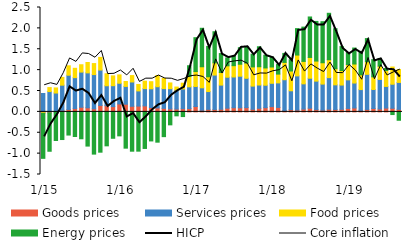
| Category | Goods prices | Services prices | Food prices | Energy prices |
|---|---|---|---|---|
|  1/15 | -0.019 | 0.44 | -0.016 | -1.079 |
| 2 | -0.027 | 0.486 | 0.095 | -0.917 |
| 3 | -0.003 | 0.452 | 0.122 | -0.684 |
| 4 | 0.037 | 0.603 | 0.186 | -0.662 |
| 5 | 0.058 | 0.82 | 0.226 | -0.555 |
| 6 | 0.079 | 0.741 | 0.224 | -0.591 |
| 7 | 0.111 | 0.842 | 0.176 | -0.644 |
| 8 | 0.098 | 0.837 | 0.249 | -0.819 |
| 9 | 0.074 | 0.82 | 0.263 | -1.012 |
| 10 | 0.155 | 0.847 | 0.303 | -0.966 |
| 11 | 0.147 | 0.478 | 0.287 | -0.813 |
| 12 | 0.126 | 0.501 | 0.234 | -0.632 |
|  1/16 | 0.19 | 0.495 | 0.2 | -0.574 |
| 2 | 0.183 | 0.426 | 0.117 | -0.869 |
| 3 | 0.134 | 0.582 | 0.153 | -0.942 |
| 4 | 0.139 | 0.363 | 0.155 | -0.941 |
| 5 | 0.144 | 0.414 | 0.178 | -0.876 |
| 6 | 0.104 | 0.449 | 0.17 | -0.696 |
| 7 | 0.095 | 0.508 | 0.269 | -0.726 |
| 8 | 0.084 | 0.473 | 0.245 | -0.593 |
| 9 | 0.071 | 0.485 | 0.137 | -0.311 |
| 10 | 0.068 | 0.45 | 0.076 | -0.095 |
| 11 | 0.076 | 0.474 | 0.138 | -0.112 |
| 12 | 0.079 | 0.521 | 0.246 | 0.26 |
|  1/17 | 0.128 | 0.48 | 0.357 | 0.811 |
| 2 | 0.04 | 0.537 | 0.504 | 0.922 |
| 3 | 0.06 | 0.426 | 0.354 | 0.727 |
| 4 | 0.058 | 0.824 | 0.292 | 0.745 |
| 5 | 0.063 | 0.579 | 0.301 | 0.454 |
| 6 | 0.089 | 0.742 | 0.273 | 0.189 |
| 7 | 0.1 | 0.737 | 0.271 | 0.222 |
| 8 | 0.097 | 0.758 | 0.286 | 0.396 |
| 9 | 0.102 | 0.703 | 0.365 | 0.396 |
| 10 | 0.062 | 0.555 | 0.46 | 0.304 |
| 11 | 0.086 | 0.557 | 0.438 | 0.479 |
| 12 | 0.101 | 0.537 | 0.414 | 0.304 |
|  1/18 | 0.126 | 0.559 | 0.39 | 0.238 |
| 2 | 0.107 | 0.587 | 0.211 | 0.229 |
| 3 | 0.034 | 0.736 | 0.415 | 0.215 |
| 4 | 0.054 | 0.451 | 0.474 | 0.269 |
| 5 | 0.044 | 0.818 | 0.499 | 0.633 |
| 6 | 0.067 | 0.604 | 0.537 | 0.822 |
| 7 | 0.088 | 0.718 | 0.497 | 0.97 |
| 8 | 0.054 | 0.682 | 0.48 | 0.949 |
| 9 | 0.041 | 0.624 | 0.511 | 0.983 |
| 10 | 0.064 | 0.756 | 0.428 | 1.113 |
| 11 | 0.057 | 0.591 | 0.385 | 0.959 |
| 12 | 0.062 | 0.581 | 0.349 | 0.573 |
|  1/19 | 0.083 | 0.684 | 0.366 | 0.287 |
| 2 | 0.093 | 0.598 | 0.456 | 0.382 |
| 3 | 0.036 | 0.498 | 0.353 | 0.562 |
| 4 | 0.059 | 0.841 | 0.301 | 0.555 |
| 5 | 0.081 | 0.455 | 0.303 | 0.412 |
| 6 | 0.068 | 0.71 | 0.317 | 0.184 |
| 7 | 0.091 | 0.519 | 0.381 | 0.05 |
| 8 | 0.086 | 0.576 | 0.412 | -0.064 |
| 9 | 0.06 | 0.645 | 0.309 | -0.201 |